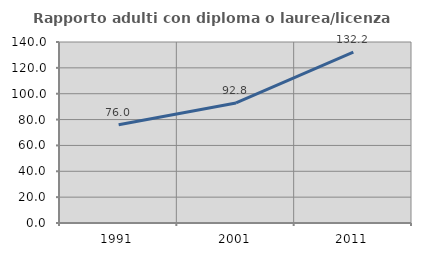
| Category | Rapporto adulti con diploma o laurea/licenza media  |
|---|---|
| 1991.0 | 76.048 |
| 2001.0 | 92.836 |
| 2011.0 | 132.215 |